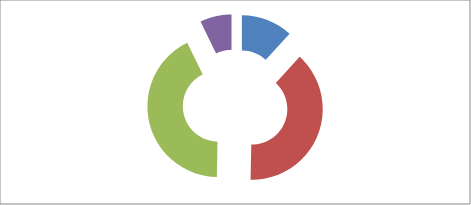
| Category | Series 0 |
|---|---|
| INGRESOS PROPIOS | 3511121297 |
| PARTICIPACIONES E INCENTIVOS | 11497249671 |
| APORTACIONES | 12675278842 |
| CONVENIOS Y ASIGNACIONES | 2149769107 |